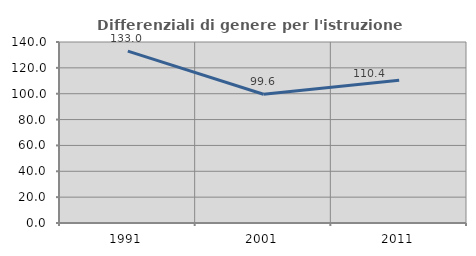
| Category | Differenziali di genere per l'istruzione superiore |
|---|---|
| 1991.0 | 132.971 |
| 2001.0 | 99.574 |
| 2011.0 | 110.443 |